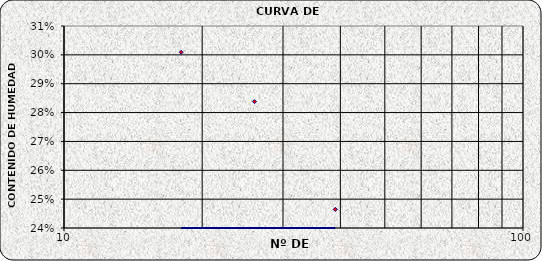
| Category | Series 0 |
|---|---|
| 39.0 | 0.246 |
| 26.0 | 0.284 |
| 18.0 | 0.301 |